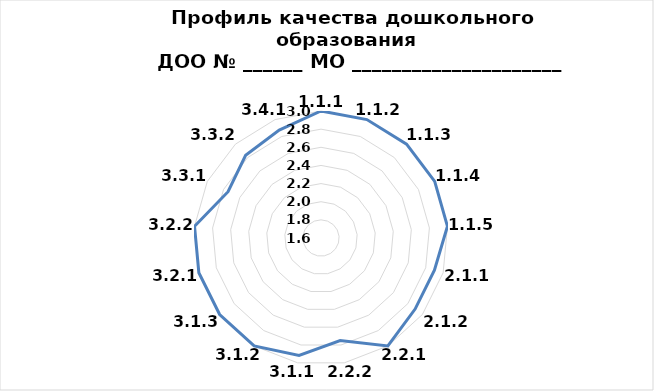
| Category | Series 0 |
|---|---|
| 1.1.1 | 3 |
| 1.1.2 | 3 |
| 1.1.3 | 3 |
| 1.1.4 | 3 |
| 1.1.5 | 3 |
| 2.1.1 | 2.9 |
| 2.1.2 | 2.9 |
| 2.2.1 | 3 |
| 2.2.2 | 2.75 |
| 3.1.1 | 2.917 |
| 3.1.2 | 3 |
| 3.1.3 | 3 |
| 3.2.1 | 3 |
| 3.2.2 | 3 |
| 3.3.1 | 2.745 |
| 3.3.2 | 2.833 |
| 3.4.1 | 2.875 |